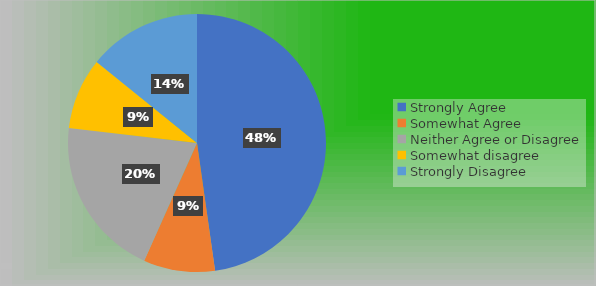
| Category | Series 0 |
|---|---|
| Strongly Agree | 64 |
| Somewhat Agree | 12 |
| Neither Agree or Disagree | 27 |
| Somewhat disagree | 12 |
| Strongly Disagree | 19 |